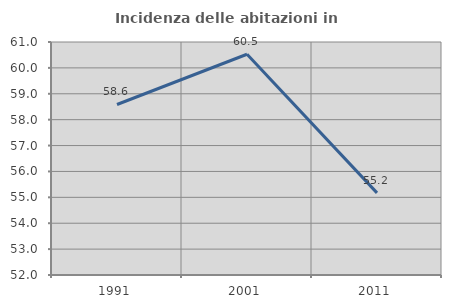
| Category | Incidenza delle abitazioni in proprietà  |
|---|---|
| 1991.0 | 58.586 |
| 2001.0 | 60.526 |
| 2011.0 | 55.172 |